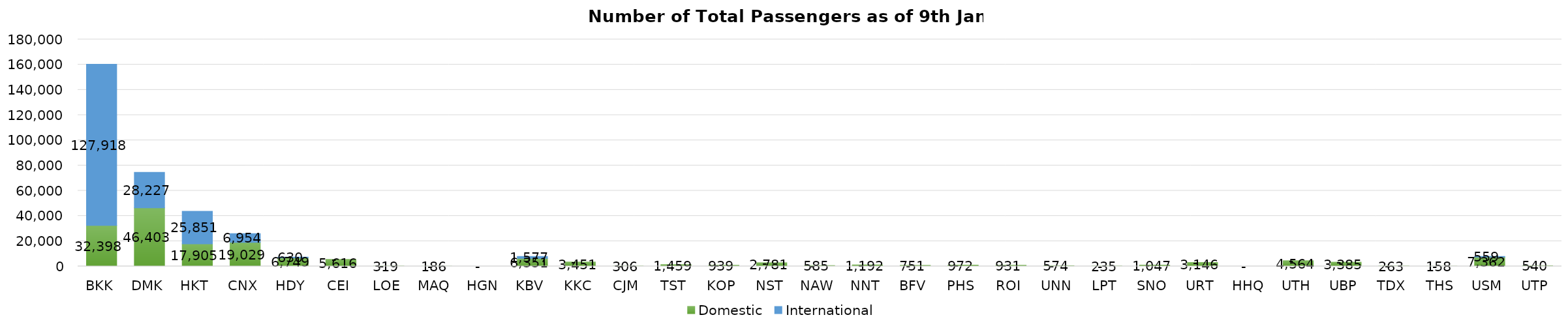
| Category | Domestic | International |
|---|---|---|
| BKK | 32398 | 127918 |
| DMK | 46403 | 28227 |
| HKT | 17905 | 25851 |
| CNX | 19029 | 6954 |
| HDY | 6749 | 630 |
| CEI | 5616 | 0 |
| LOE | 319 | 0 |
| MAQ | 186 | 0 |
| HGN | 0 | 0 |
| KBV | 6351 | 1577 |
| KKC | 3451 | 0 |
| CJM | 306 | 0 |
| TST | 1459 | 0 |
| KOP | 939 | 0 |
| NST | 2781 | 0 |
| NAW | 585 | 0 |
| NNT | 1192 | 0 |
| BFV | 751 | 0 |
| PHS | 972 | 0 |
| ROI | 931 | 0 |
| UNN | 574 | 0 |
| LPT | 235 | 0 |
| SNO | 1047 | 0 |
| URT | 3146 | 0 |
| HHQ | 0 | 0 |
| UTH | 4564 | 0 |
| UBP | 3385 | 0 |
| TDX | 263 | 0 |
| THS | 158 | 0 |
| USM | 7362 | 559 |
| UTP | 540 | 0 |